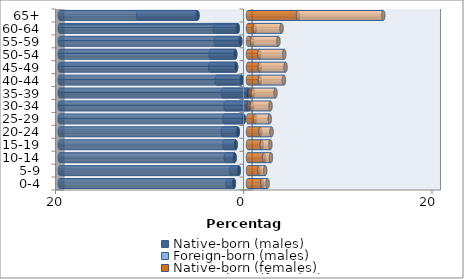
| Category | Native-born (males) | Foreign-born (males) | Native-born (females) | Foreign-born (females) |
|---|---|---|---|---|
| 0-4 | -1.501 | -0.677 | 1.525 | 0.558 |
| 5-9 | -0.983 | -0.796 | 1.205 | 0.626 |
| 10-14 | -1.427 | -0.944 | 1.713 | 0.724 |
| 15-19 | -1.316 | -1.197 | 1.459 | 0.917 |
| 20-24 | -1.089 | -1.581 | 1.327 | 1.174 |
| 25-29 | -0.455 | -2.062 | 0.761 | 1.546 |
| 30-34 | 0.111 | -2.376 | 0.317 | 1.964 |
| 35-39 | 0.264 | -2.672 | 0.267 | 2.392 |
| 40-44 | -0.693 | -2.641 | 1.261 | 2.559 |
| 45-49 | -1.269 | -2.762 | 1.248 | 2.739 |
| 50-54 | -1.359 | -2.617 | 1.205 | 2.643 |
| 55-59 | -0.814 | -2.604 | 0.447 | 2.784 |
| 60-64 | -1.094 | -2.458 | 0.73 | 2.839 |
| 65+ | -5.369 | -6.312 | 5.308 | 9.067 |